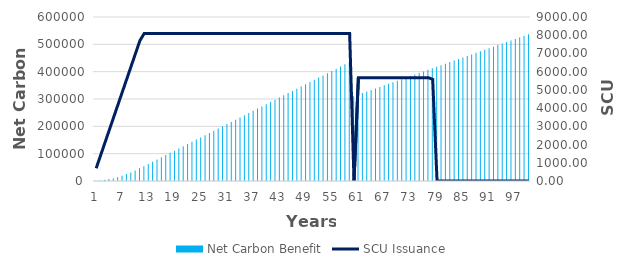
| Category | Time | Series 1 | Series 2 | Net Carbon Benefit | Series 6 | Series 9 |
|---|---|---|---|---|---|---|
| 0 | 1 |  |  | 700 |  |  |
| 1 | 2 |  |  | 2100 |  |  |
| 2 | 3 |  |  | 4200 |  |  |
| 3 | 4 |  |  | 7000 |  |  |
| 4 | 5 |  |  | 10500 |  |  |
| 5 | 6 |  |  | 14700 |  |  |
| 6 | 7 |  |  | 19600 |  |  |
| 7 | 8 |  |  | 25200 |  |  |
| 8 | 9 |  |  | 31500 |  |  |
| 9 | 10 |  |  | 38500 |  |  |
| 10 | 11 |  |  | 46200 |  |  |
| 11 | 12 |  |  | 54300 |  |  |
| 12 | 13 |  |  | 62400 |  |  |
| 13 | 14 |  |  | 70500 |  |  |
| 14 | 15 |  |  | 78600 |  |  |
| 15 | 16 |  |  | 86700 |  |  |
| 16 | 17 |  |  | 94800 |  |  |
| 17 | 18 |  |  | 102900 |  |  |
| 18 | 19 |  |  | 111000 |  |  |
| 19 | 20 |  |  | 119100 |  |  |
| 20 | 21 |  |  | 127200 |  |  |
| 21 | 22 |  |  | 135300 |  |  |
| 22 | 23 |  |  | 143400 |  |  |
| 23 | 24 |  |  | 151500 |  |  |
| 24 | 25 |  |  | 159600 |  |  |
| 25 | 26 |  |  | 167700 |  |  |
| 26 | 27 |  |  | 175800 |  |  |
| 27 | 28 |  |  | 183900 |  |  |
| 28 | 29 |  |  | 192000 |  |  |
| 29 | 30 |  |  | 200100 |  |  |
| 30 | 31 |  |  | 208200 |  |  |
| 31 | 32 |  |  | 216300 |  |  |
| 32 | 33 |  |  | 224400 |  |  |
| 33 | 34 |  |  | 232500 |  |  |
| 34 | 35 |  |  | 240600 |  |  |
| 35 | 36 |  |  | 248700 |  |  |
| 36 | 37 |  |  | 256800 |  |  |
| 37 | 38 |  |  | 264900 |  |  |
| 38 | 39 |  |  | 273000 |  |  |
| 39 | 40 |  |  | 281100 |  |  |
| 40 | 41 |  |  | 289200 |  |  |
| 41 | 42 |  |  | 297300 |  |  |
| 42 | 43 |  |  | 305400 |  |  |
| 43 | 44 |  |  | 313500 |  |  |
| 44 | 45 |  |  | 321600 |  |  |
| 45 | 46 |  |  | 329700 |  |  |
| 46 | 47 |  |  | 337800 |  |  |
| 47 | 48 |  |  | 345900 |  |  |
| 48 | 49 |  |  | 354000 |  |  |
| 49 | 50 |  |  | 362100 |  |  |
| 50 | 51 |  |  | 370200 |  |  |
| 51 | 52 |  |  | 378300 |  |  |
| 52 | 53 |  |  | 386400 |  |  |
| 53 | 54 |  |  | 394500 |  |  |
| 54 | 55 |  |  | 402600 |  |  |
| 55 | 56 |  |  | 410700 |  |  |
| 56 | 57 |  |  | 418800 |  |  |
| 57 | 58 |  |  | 426900 |  |  |
| 58 | 59 |  |  | 435000 |  |  |
| 59 | 60 |  |  | 310170 |  |  |
| 60 | 61 |  |  | 315840 |  |  |
| 61 | 62 |  |  | 321510 |  |  |
| 62 | 63 |  |  | 327180 |  |  |
| 63 | 64 |  |  | 332850 |  |  |
| 64 | 65 |  |  | 338520 |  |  |
| 65 | 66 |  |  | 344190 |  |  |
| 66 | 67 |  |  | 349860 |  |  |
| 67 | 68 |  |  | 355530 |  |  |
| 68 | 69 |  |  | 361200 |  |  |
| 69 | 70 |  |  | 366870 |  |  |
| 70 | 71 |  |  | 372540 |  |  |
| 71 | 72 |  |  | 378210 |  |  |
| 72 | 73 |  |  | 383880 |  |  |
| 73 | 74 |  |  | 389550 |  |  |
| 74 | 75 |  |  | 395220 |  |  |
| 75 | 76 |  |  | 400890 |  |  |
| 76 | 77 |  |  | 406560 |  |  |
| 77 | 78 |  |  | 412230 |  |  |
| 78 | 79 |  |  | 417900 |  |  |
| 79 | 80 |  |  | 423570 |  |  |
| 80 | 81 |  |  | 429240 |  |  |
| 81 | 82 |  |  | 434910 |  |  |
| 82 | 83 |  |  | 440580 |  |  |
| 83 | 84 |  |  | 446250 |  |  |
| 84 | 85 |  |  | 451920 |  |  |
| 85 | 86 |  |  | 457590 |  |  |
| 86 | 87 |  |  | 463260 |  |  |
| 87 | 88 |  |  | 468930 |  |  |
| 88 | 89 |  |  | 474600 |  |  |
| 89 | 90 |  |  | 480270 |  |  |
| 90 | 91 |  |  | 485940 |  |  |
| 91 | 92 |  |  | 491610 |  |  |
| 92 | 93 |  |  | 497280 |  |  |
| 93 | 94 |  |  | 502950 |  |  |
| 94 | 95 |  |  | 508620 |  |  |
| 95 | 96 |  |  | 514290 |  |  |
| 96 | 97 |  |  | 519960 |  |  |
| 97 | 98 |  |  | 525630 |  |  |
| 98 | 99 |  |  | 531300 |  |  |
| 99 | 100 |  |  | 536970 |  |  |